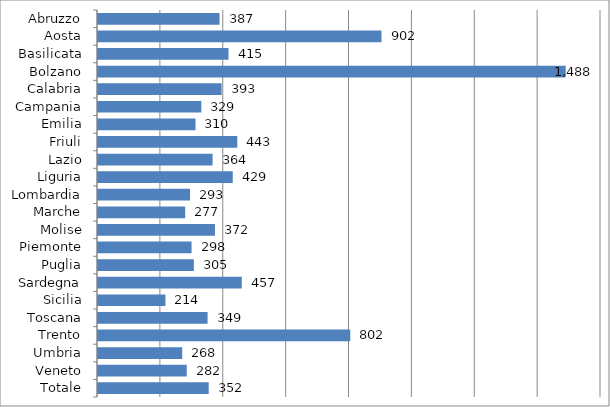
| Category | Series 0 |
|---|---|
| Abruzzo | 386.552 |
| Aosta | 901.804 |
| Basilicata | 415.126 |
| Bolzano | 1487.714 |
| Calabria | 393.214 |
| Campania | 328.61 |
| Emilia | 310.117 |
| Friuli | 443.068 |
| Lazio | 364.491 |
| Liguria | 428.657 |
| Lombardia | 292.825 |
| Marche | 277.308 |
| Molise | 372.008 |
| Piemonte | 297.638 |
| Puglia | 304.842 |
| Sardegna | 457.391 |
| Sicilia | 214.434 |
| Toscana | 348.554 |
| Trento | 802.471 |
| Umbria | 267.872 |
| Veneto | 282.39 |
| Totale | 352.159 |